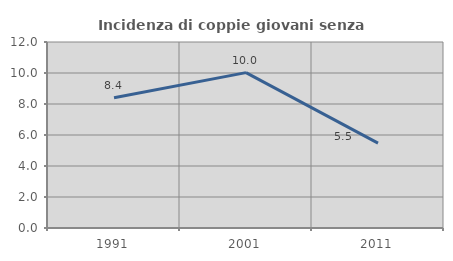
| Category | Incidenza di coppie giovani senza figli |
|---|---|
| 1991.0 | 8.403 |
| 2001.0 | 10.026 |
| 2011.0 | 5.474 |